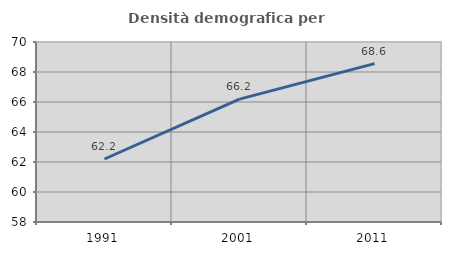
| Category | Densità demografica |
|---|---|
| 1991.0 | 62.2 |
| 2001.0 | 66.189 |
| 2011.0 | 68.56 |